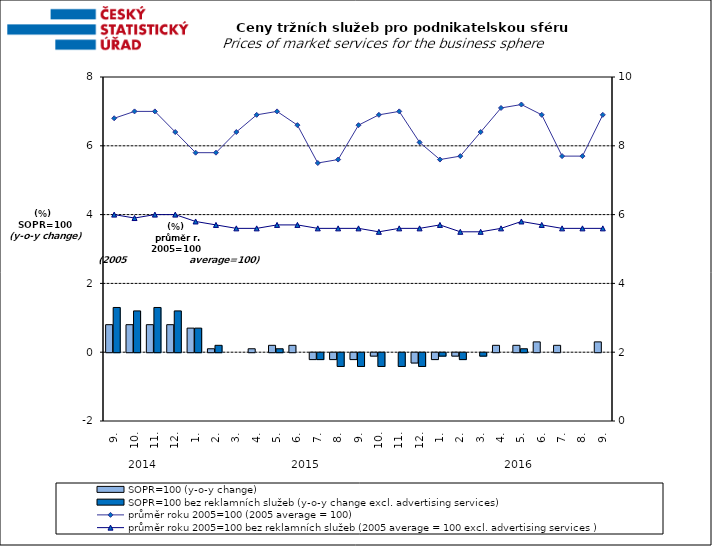
| Category | SOPR=100 (y-o-y change)   | SOPR=100 bez reklamních služeb (y-o-y change excl. advertising services)   |
|---|---|---|
| 0 | 0.8 | 1.3 |
| 1 | 0.8 | 1.2 |
| 2 | 0.8 | 1.3 |
| 3 | 0.8 | 1.2 |
| 4 | 0.7 | 0.7 |
| 5 | 0.1 | 0.2 |
| 6 | 0 | 0 |
| 7 | 0.1 | 0 |
| 8 | 0.2 | 0.1 |
| 9 | 0.2 | 0 |
| 10 | -0.2 | -0.2 |
| 11 | -0.2 | -0.4 |
| 12 | -0.2 | -0.4 |
| 13 | -0.1 | -0.4 |
| 14 | 0 | -0.4 |
| 15 | -0.3 | -0.4 |
| 16 | -0.2 | -0.1 |
| 17 | -0.1 | -0.2 |
| 18 | 0 | -0.1 |
| 19 | 0.2 | 0 |
| 20 | 0.2 | 0.1 |
| 21 | 0.3 | 0 |
| 22 | 0.2 | 0 |
| 23 | 0 | 0 |
| 24 | 0.3 | 0 |